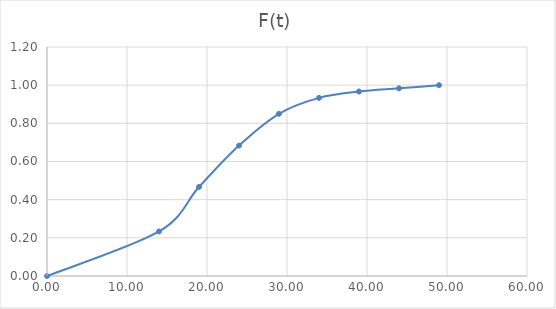
| Category | F(t) |
|---|---|
| 0.0 | 0 |
| 14.0 | 0.233 |
| 19.0 | 0.467 |
| 24.0 | 0.683 |
| 29.0 | 0.85 |
| 34.0 | 0.933 |
| 39.0 | 0.967 |
| 44.0 | 0.983 |
| 49.0 | 1 |